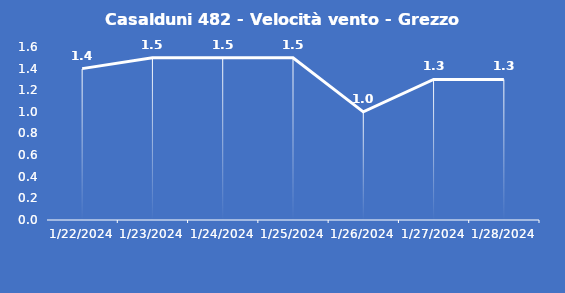
| Category | Casalduni 482 - Velocità vento - Grezzo (m/s) |
|---|---|
| 1/22/24 | 1.4 |
| 1/23/24 | 1.5 |
| 1/24/24 | 1.5 |
| 1/25/24 | 1.5 |
| 1/26/24 | 1 |
| 1/27/24 | 1.3 |
| 1/28/24 | 1.3 |